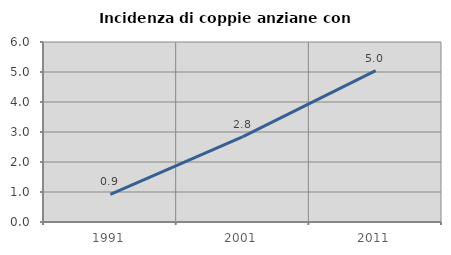
| Category | Incidenza di coppie anziane con figli |
|---|---|
| 1991.0 | 0.922 |
| 2001.0 | 2.844 |
| 2011.0 | 5.046 |